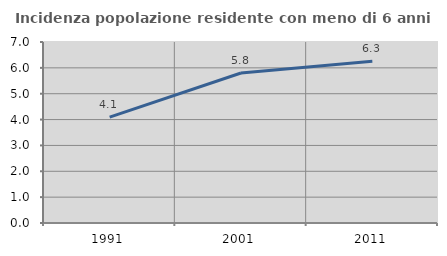
| Category | Incidenza popolazione residente con meno di 6 anni |
|---|---|
| 1991.0 | 4.096 |
| 2001.0 | 5.8 |
| 2011.0 | 6.256 |